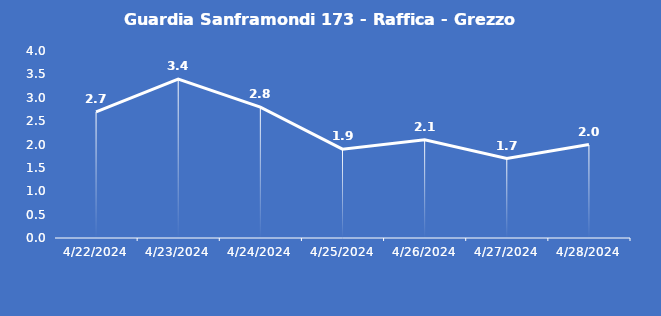
| Category | Guardia Sanframondi 173 - Raffica - Grezzo (m/s) |
|---|---|
| 4/22/24 | 2.7 |
| 4/23/24 | 3.4 |
| 4/24/24 | 2.8 |
| 4/25/24 | 1.9 |
| 4/26/24 | 2.1 |
| 4/27/24 | 1.7 |
| 4/28/24 | 2 |